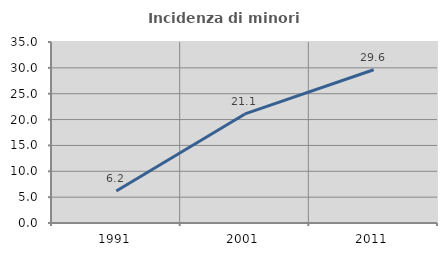
| Category | Incidenza di minori stranieri |
|---|---|
| 1991.0 | 6.195 |
| 2001.0 | 21.092 |
| 2011.0 | 29.634 |